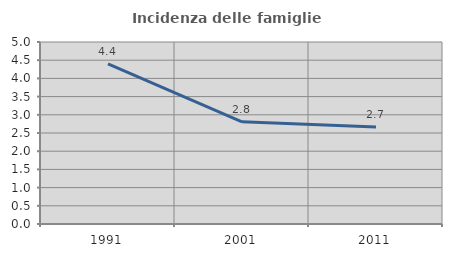
| Category | Incidenza delle famiglie numerose |
|---|---|
| 1991.0 | 4.401 |
| 2001.0 | 2.807 |
| 2011.0 | 2.667 |